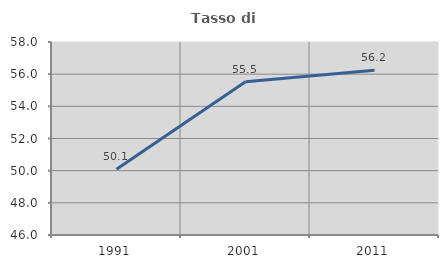
| Category | Tasso di occupazione   |
|---|---|
| 1991.0 | 50.088 |
| 2001.0 | 55.523 |
| 2011.0 | 56.243 |